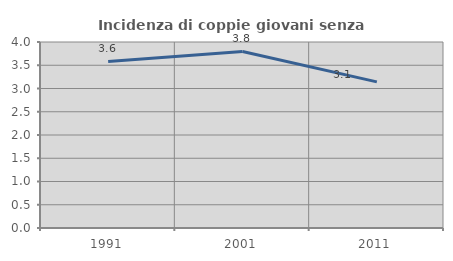
| Category | Incidenza di coppie giovani senza figli |
|---|---|
| 1991.0 | 3.581 |
| 2001.0 | 3.797 |
| 2011.0 | 3.143 |